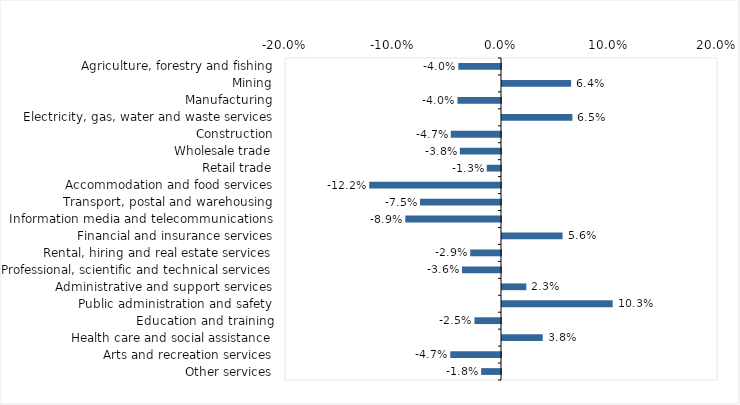
| Category | This week |
|---|---|
| Agriculture, forestry and fishing | -0.04 |
| Mining | 0.064 |
| Manufacturing | -0.04 |
| Electricity, gas, water and waste services | 0.065 |
| Construction | -0.046 |
| Wholesale trade | -0.038 |
| Retail trade | -0.013 |
| Accommodation and food services | -0.122 |
| Transport, postal and warehousing | -0.075 |
| Information media and telecommunications | -0.089 |
| Financial and insurance services | 0.056 |
| Rental, hiring and real estate services | -0.028 |
| Professional, scientific and technical services | -0.036 |
| Administrative and support services | 0.022 |
| Public administration and safety | 0.102 |
| Education and training | -0.025 |
| Health care and social assistance | 0.038 |
| Arts and recreation services | -0.047 |
| Other services | -0.018 |